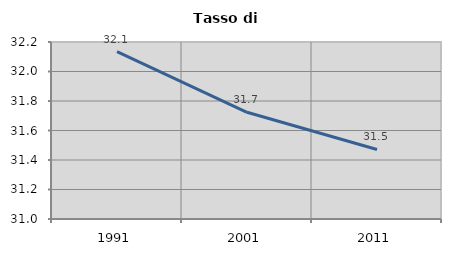
| Category | Tasso di disoccupazione   |
|---|---|
| 1991.0 | 32.135 |
| 2001.0 | 31.723 |
| 2011.0 | 31.472 |